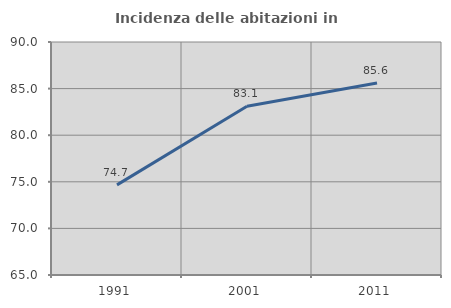
| Category | Incidenza delle abitazioni in proprietà  |
|---|---|
| 1991.0 | 74.667 |
| 2001.0 | 83.108 |
| 2011.0 | 85.606 |